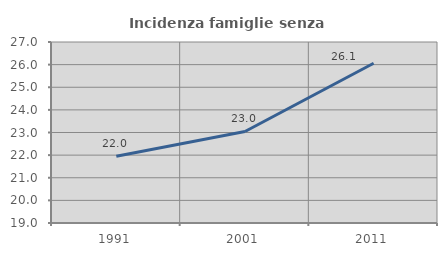
| Category | Incidenza famiglie senza nuclei |
|---|---|
| 1991.0 | 21.951 |
| 2001.0 | 23.046 |
| 2011.0 | 26.059 |